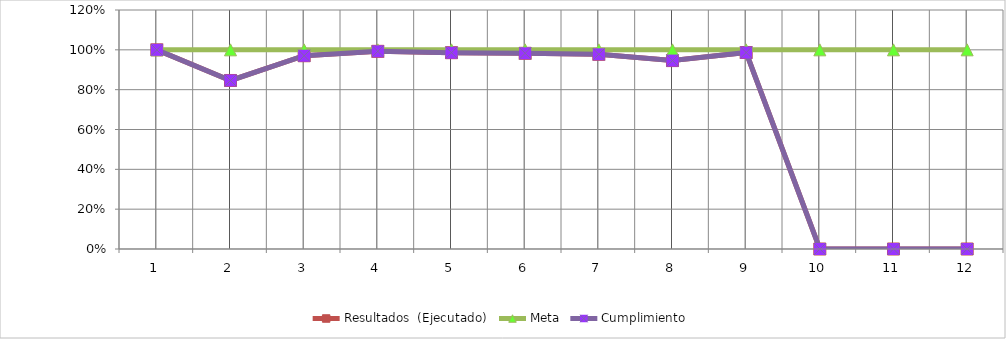
| Category | Resultados  (Ejecutado) | Meta | Cumplimiento |
|---|---|---|---|
| 0 | 1 | 1 | 1 |
| 1 | 0.846 | 1 | 0.846 |
| 2 | 0.97 | 1 | 0.97 |
| 3 | 0.992 | 1 | 0.992 |
| 4 | 0.986 | 1 | 0.986 |
| 5 | 0.983 | 1 | 0.983 |
| 6 | 0.978 | 1 | 0.978 |
| 7 | 0.946 | 1 | 0.946 |
| 8 | 0.986 | 1 | 0.986 |
| 9 | 0 | 1 | 0 |
| 10 | 0 | 1 | 0 |
| 11 | 0 | 1 | 0 |